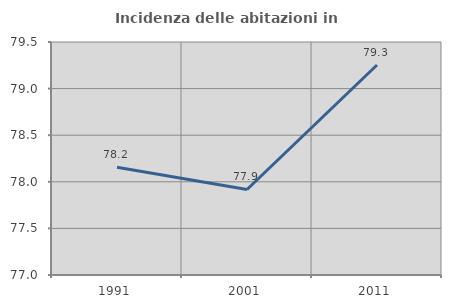
| Category | Incidenza delle abitazioni in proprietà  |
|---|---|
| 1991.0 | 78.156 |
| 2001.0 | 77.918 |
| 2011.0 | 79.253 |